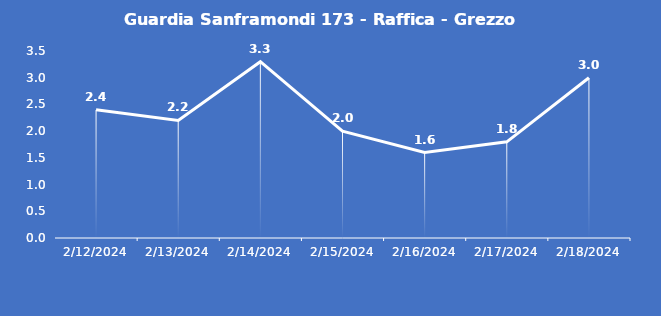
| Category | Guardia Sanframondi 173 - Raffica - Grezzo (m/s) |
|---|---|
| 2/12/24 | 2.4 |
| 2/13/24 | 2.2 |
| 2/14/24 | 3.3 |
| 2/15/24 | 2 |
| 2/16/24 | 1.6 |
| 2/17/24 | 1.8 |
| 2/18/24 | 3 |